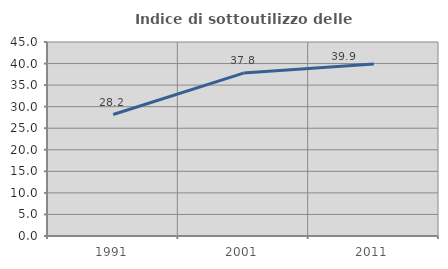
| Category | Indice di sottoutilizzo delle abitazioni  |
|---|---|
| 1991.0 | 28.18 |
| 2001.0 | 37.786 |
| 2011.0 | 39.924 |